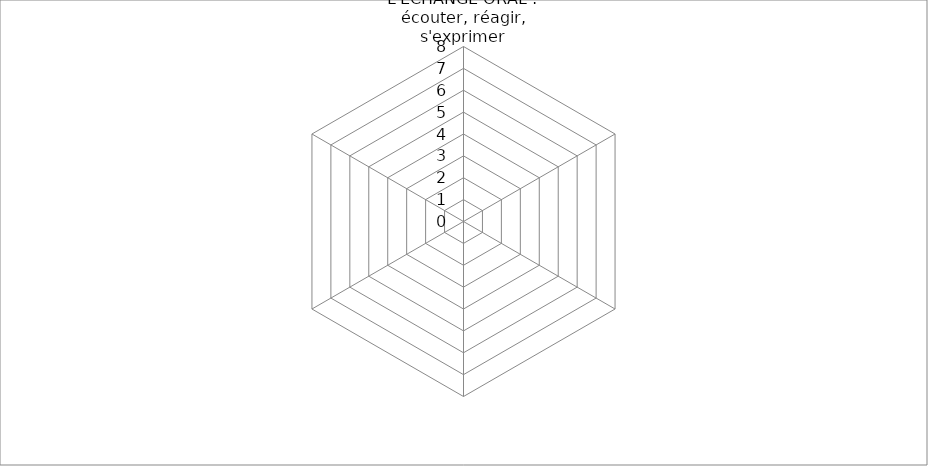
| Category | Series 1 |
|---|---|
| 1. ENTRER DANS L'ECHANGE ORAL : écouter, réagir, s'exprimer | 0 |
| 2. ENTRER DANS L'ECHANGE ECRIT : lire, analyser, écrire | 0 |
| 3. DEVENIR UN LECTEUR COMPETENT ET CRITIQUE  | 0 |
| 4. CONFRONTER DES SAVOIRS ET DES VALEURS POUR CONSTRUIRE SON IDENTITE CULTURELLE | 0 |
| 5. SAVOIR S'INFORMER ET ETRE AUTONOMIE | 0 |
| 6. COOPERER, MUTUALISER | 0 |